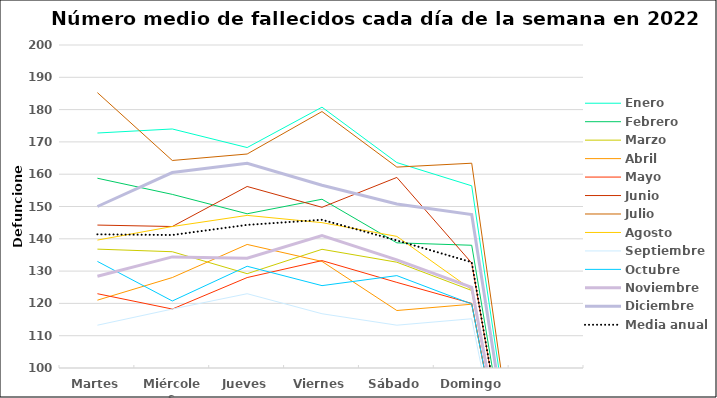
| Category | Enero | Febrero | Marzo | Abril | Mayo | Junio | Julio | Agosto | Septiembre | Octubre | Noviembre | Diciembre | Media anual |
|---|---|---|---|---|---|---|---|---|---|---|---|---|---|
| Martes | 172.75 | 158.75 | 136.8 | 121 | 123 | 144.25 | 185.25 | 139.6 | 113.25 | 133 | 128.4 | 150 | 141.385 |
| Miércoles | 174 | 153.75 | 136 | 128 | 118.25 | 143.8 | 164.25 | 143.8 | 118.25 | 120.75 | 134.4 | 160.5 | 141.173 |
| Jueves | 168.25 | 147.75 | 129.2 | 138.25 | 128 | 156.2 | 166.25 | 147.25 | 123 | 131.5 | 134 | 163.4 | 144.308 |
| Viernes | 180.75 | 152.25 | 136.75 | 133 | 133.25 | 149.75 | 179.4 | 145 | 116.8 | 125.5 | 141 | 156.6 | 145.885 |
| Sábado | 163.6 | 138.75 | 132.75 | 117.8 | 126.5 | 159 | 162.2 | 140.75 | 113.25 | 128.6 | 133.5 | 150.8 | 139.491 |
| Domingo | 156.4 | 138 | 124 | 119.75 | 120 | 132.5 | 163.4 | 124.25 | 115.25 | 119.8 | 125 | 147.5 | 132.75 |